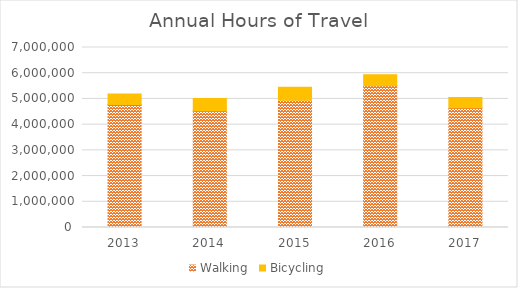
| Category | Walking | Bicycling |
|---|---|---|
| 2013 | 4781695.679 | 410534.398 |
| 2014 | 4541415.842 | 474647.173 |
| 2015 | 4947792.326 | 505304.945 |
| 2016 | 5509097.969 | 435370.951 |
| 2017 | 4657811.913 | 400701.568 |